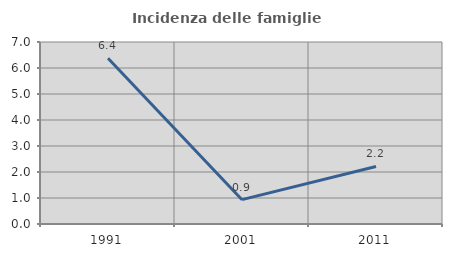
| Category | Incidenza delle famiglie numerose |
|---|---|
| 1991.0 | 6.373 |
| 2001.0 | 0.936 |
| 2011.0 | 2.212 |